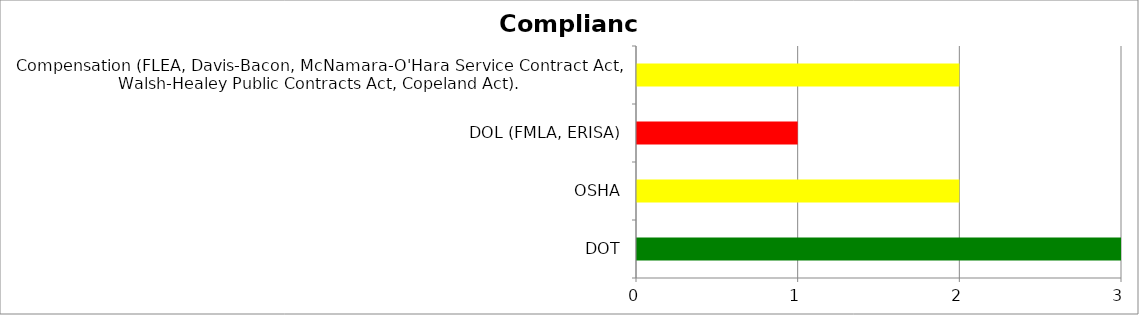
| Category | Low | Medium | High |
|---|---|---|---|
| DOT | 3 | 0 | 0 |
| OSHA | 0 | 2 | 0 |
| DOL (FMLA, ERISA) | 0 | 0 | 1 |
| Compensation (FLEA, Davis-Bacon, McNamara-O'Hara Service Contract Act, Walsh-Healey Public Contracts Act, Copeland Act). | 0 | 2 | 0 |